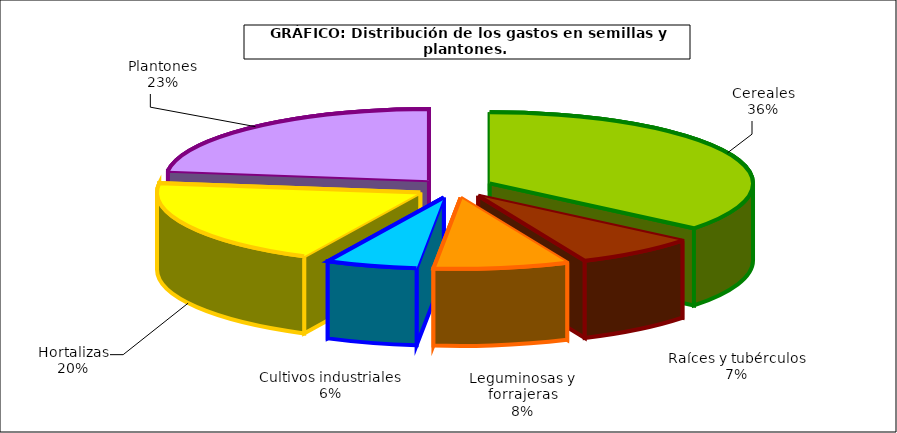
| Category | Series 0 |
|---|---|
| 0 | 501.29 |
| 1 | 104.778 |
| 2 | 115.687 |
| 3 | 78.532 |
| 4 | 277.072 |
| 5 | 320.073 |